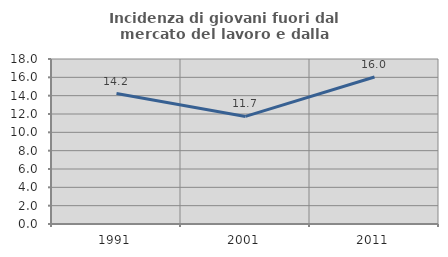
| Category | Incidenza di giovani fuori dal mercato del lavoro e dalla formazione  |
|---|---|
| 1991.0 | 14.231 |
| 2001.0 | 11.737 |
| 2011.0 | 16.038 |